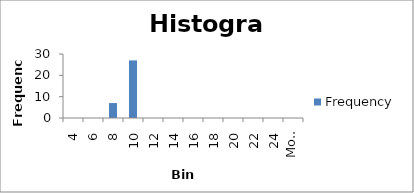
| Category | Frequency |
|---|---|
| 4 | 0 |
| 6 | 0 |
| 8 | 7 |
| 10 | 27 |
| 12 | 0 |
| 14 | 0 |
| 16 | 0 |
| 18 | 0 |
| 20 | 0 |
| 22 | 0 |
| 24 | 0 |
| More | 0 |